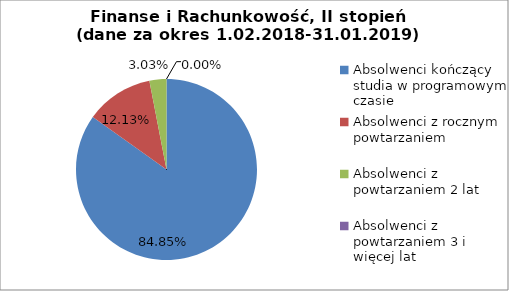
| Category | Series 0 |
|---|---|
| Absolwenci kończący studia w programowym czasie | 84.848 |
| Absolwenci z rocznym powtarzaniem | 12.121 |
| Absolwenci z powtarzaniem 2 lat | 3.03 |
| Absolwenci z powtarzaniem 3 i więcej lat | 0 |